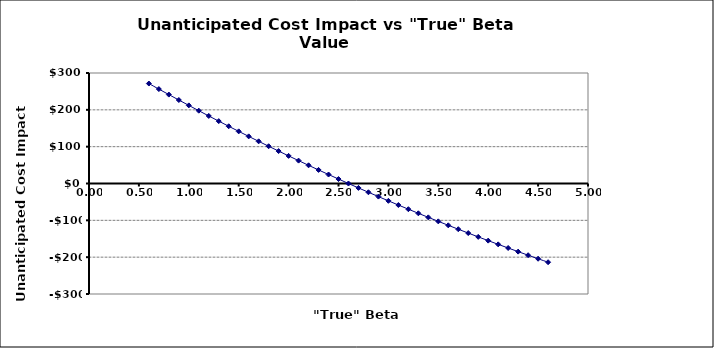
| Category | Series 0 |
|---|---|
| 0.6000000000000001 | 271369.299 |
| 0.7000000000000001 | 256307.924 |
| 0.8 | 241408.593 |
| 0.9 | 226670.607 |
| 1.0 | 212093.232 |
| 1.1 | 197675.709 |
| 1.2000000000000002 | 183417.246 |
| 1.3000000000000003 | 169317.027 |
| 1.4000000000000004 | 155374.209 |
| 1.5000000000000004 | 141587.924 |
| 1.6000000000000005 | 127957.28 |
| 1.7000000000000006 | 114481.362 |
| 1.8000000000000007 | 101159.234 |
| 1.9000000000000008 | 87989.94 |
| 2.000000000000001 | 74972.503 |
| 2.100000000000001 | 62105.928 |
| 2.200000000000001 | 49389.204 |
| 2.300000000000001 | 36821.301 |
| 2.4000000000000012 | 24401.174 |
| 2.5000000000000013 | 12127.765 |
| 2.6000000000000014 | 0 |
| 2.7000000000000015 | -11983.207 |
| 2.8000000000000016 | -23822.955 |
| 2.9000000000000017 | -35520.353 |
| 3.0000000000000018 | -47076.522 |
| 3.100000000000002 | -58492.591 |
| 3.200000000000002 | -69769.7 |
| 3.300000000000002 | -80908.997 |
| 3.400000000000002 | -91911.635 |
| 3.500000000000002 | -102778.777 |
| 3.6000000000000023 | -113511.592 |
| 3.7000000000000024 | -124111.253 |
| 3.8000000000000025 | -134578.938 |
| 3.9000000000000026 | -144915.83 |
| 4.000000000000003 | -155123.117 |
| 4.100000000000002 | -165201.988 |
| 4.200000000000002 | -175153.636 |
| 4.300000000000002 | -184979.255 |
| 4.400000000000001 | -194680.042 |
| 4.500000000000001 | -204257.194 |
| 4.6000000000000005 | -213711.908 |